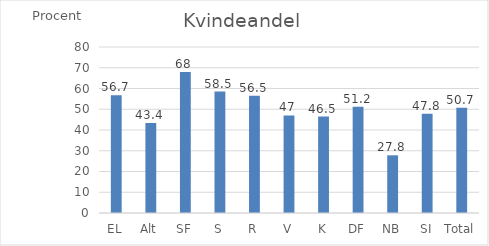
| Category | Kvindeandel |
|---|---|
| EL | 56.7 |
| Alt | 43.4 |
| SF | 68 |
| S | 58.5 |
| R | 56.5 |
| V | 47 |
| K | 46.5 |
| DF | 51.2 |
| NB | 27.8 |
| SI | 47.8 |
| Total | 50.7 |